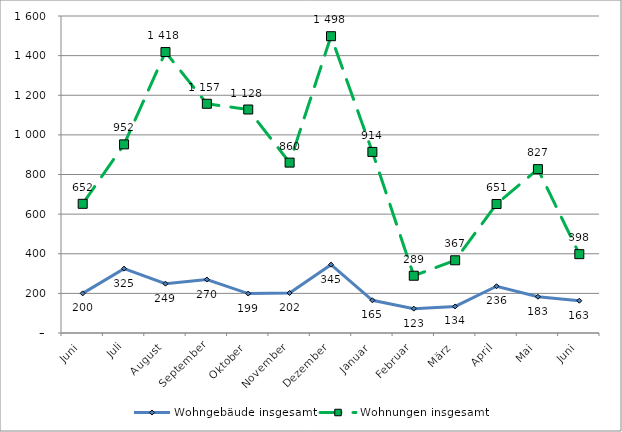
| Category | Wohngebäude insgesamt | Wohnungen insgesamt |
|---|---|---|
| Juni | 200 | 652 |
| Juli | 325 | 952 |
| August | 249 | 1418 |
| September | 270 | 1157 |
| Oktober | 199 | 1128 |
| November | 202 | 860 |
| Dezember | 345 | 1498 |
| Januar | 165 | 914 |
| Februar | 123 | 289 |
| März | 134 | 367 |
| April | 236 | 651 |
| Mai | 183 | 827 |
| Juni | 163 | 398 |